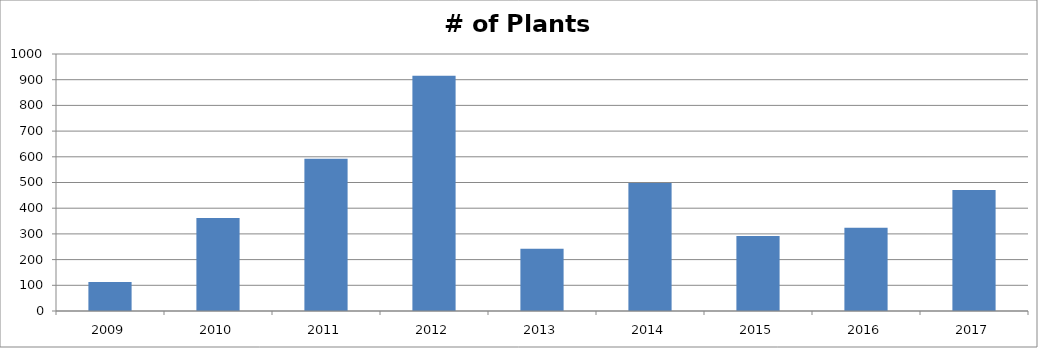
| Category | # of Plants Observed |
|---|---|
| 2009.0 | 113 |
| 2010.0 | 362 |
| 2011.0 | 592 |
| 2012.0 | 915 |
| 2013.0 | 242 |
| 2014.0 | 498 |
| 2015.0 | 292 |
| 2016.0 | 324 |
| 2017.0 | 471 |